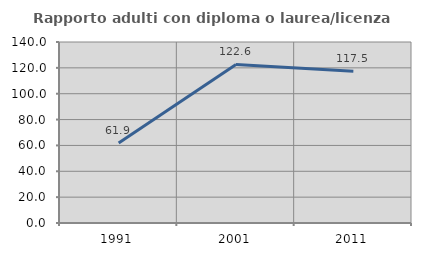
| Category | Rapporto adulti con diploma o laurea/licenza media  |
|---|---|
| 1991.0 | 61.905 |
| 2001.0 | 122.642 |
| 2011.0 | 117.46 |